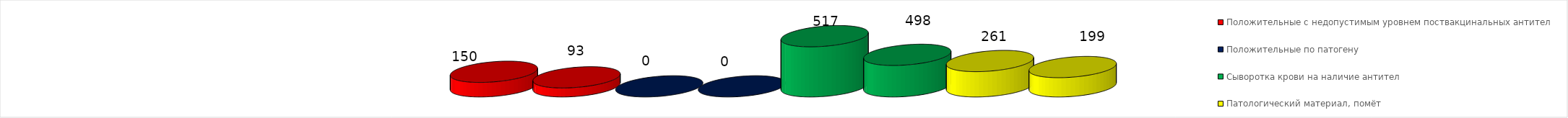
| Category | Положительные с недопустимым уровнем поствакцинальных антител | Положительные по патогену | Сыворотка крови на наличие антител | Патологический материал, помёт |
|---|---|---|---|---|
| Сыворотка крови на наличие антител | 93 | 0 | 325 | 199 |